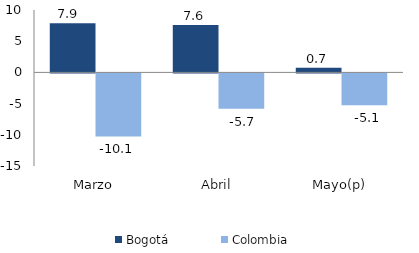
| Category | Bogotá | Colombia |
|---|---|---|
| Marzo | 7.883 | -10.098 |
| Abril | 7.592 | -5.658 |
| Mayo(p) | 0.733 | -5.116 |